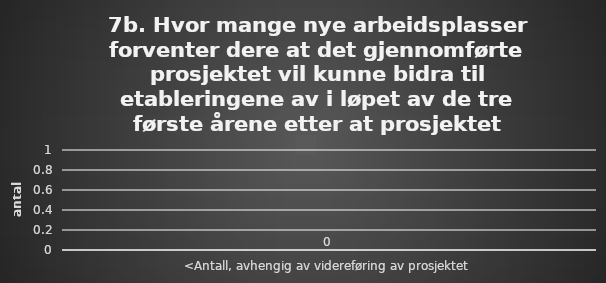
| Category | Series 0 |
|---|---|
| <Antall, avhengig av videreføring av prosjektet | 0 |